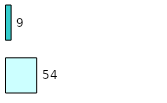
| Category | Series 0 | Series 1 |
|---|---|---|
| 0 | 54 | 9 |